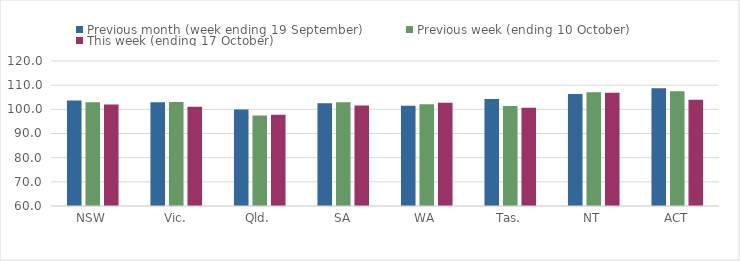
| Category | Previous month (week ending 19 September) | Previous week (ending 10 October) | This week (ending 17 October) |
|---|---|---|---|
| NSW | 103.65 | 102.89 | 101.98 |
| Vic. | 102.91 | 103.01 | 101.02 |
| Qld. | 99.94 | 97.47 | 97.81 |
| SA | 102.55 | 102.91 | 101.58 |
| WA | 101.52 | 102.12 | 102.75 |
| Tas. | 104.31 | 101.39 | 100.67 |
| NT | 106.35 | 107.06 | 106.82 |
| ACT | 108.69 | 107.52 | 103.96 |